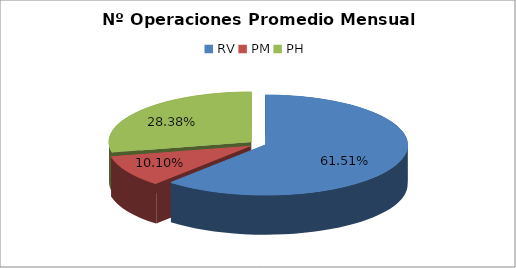
| Category | Series 0 |
|---|---|
| RV | 19413.417 |
| PM | 3189.25 |
| PH | 8958.5 |